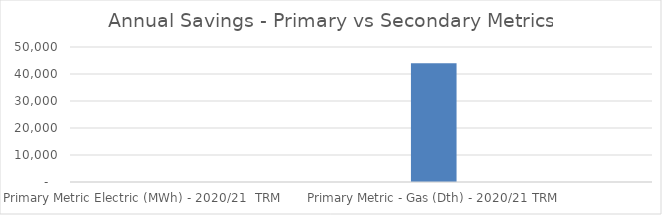
| Category | Series 0 |
|---|---|
|  Primary Metric Electric (MWh) - 2020/21  TRM  | 0 |
|  Secondary Metric Electric (MWh) 2022 TRM  | 0 |
|  Primary Metric - Gas (Dth) - 2020/21 TRM  | 43938.099 |
|  Secondary Metric - Gas (Dth) - 2022 TRM  | 0 |